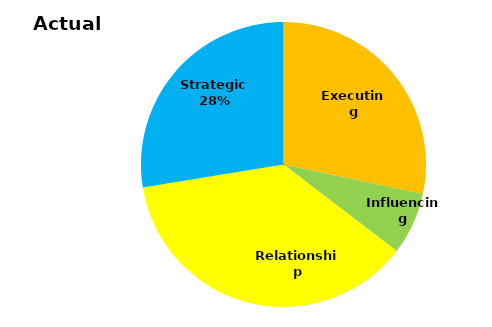
| Category | Series 0 |
|---|---|
| Executing | 0.283 |
| Influencing | 0.071 |
| Relationship | 0.37 |
| Strategic  | 0.276 |